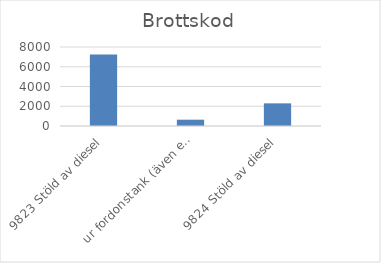
| Category | Summa |
|---|---|
| 9823 Stöld av diesel, ur fordonstank (även entreprenadmaskin m.m.) | 7237 |
| 9824 Stöld av diesel, ur större tankar (ej kopplade till fordon) | 639 |
| 9825 Stöld av drivmedel (även diesel), ej genom smitning | 2294 |